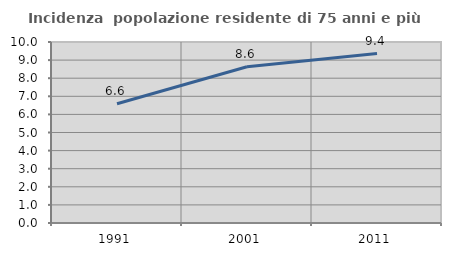
| Category | Incidenza  popolazione residente di 75 anni e più |
|---|---|
| 1991.0 | 6.59 |
| 2001.0 | 8.636 |
| 2011.0 | 9.36 |